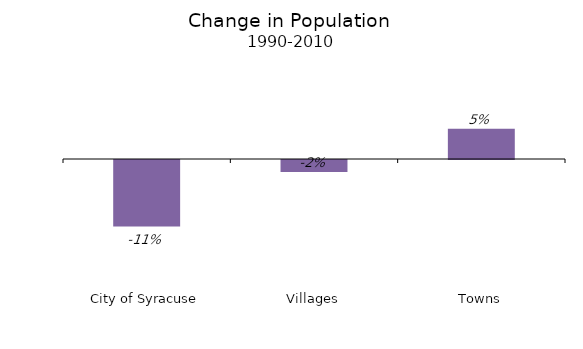
| Category | % change |
|---|---|
| City of Syracuse | -0.11 |
| Villages | -0.02 |
| Towns | 0.05 |